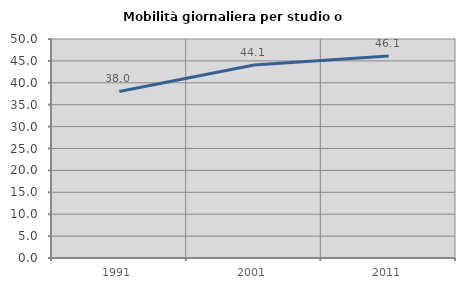
| Category | Mobilità giornaliera per studio o lavoro |
|---|---|
| 1991.0 | 38.024 |
| 2001.0 | 44.081 |
| 2011.0 | 46.133 |